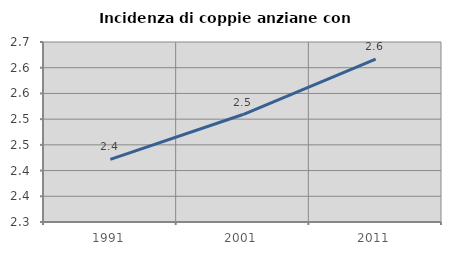
| Category | Incidenza di coppie anziane con figli |
|---|---|
| 1991.0 | 2.422 |
| 2001.0 | 2.509 |
| 2011.0 | 2.617 |